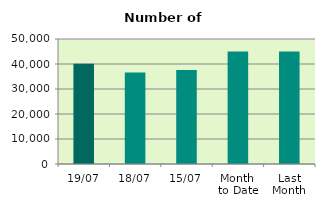
| Category | Series 0 |
|---|---|
| 19/07 | 40116 |
| 18/07 | 36638 |
| 15/07 | 37618 |
| Month 
to Date | 44989.692 |
| Last
Month | 45009.909 |